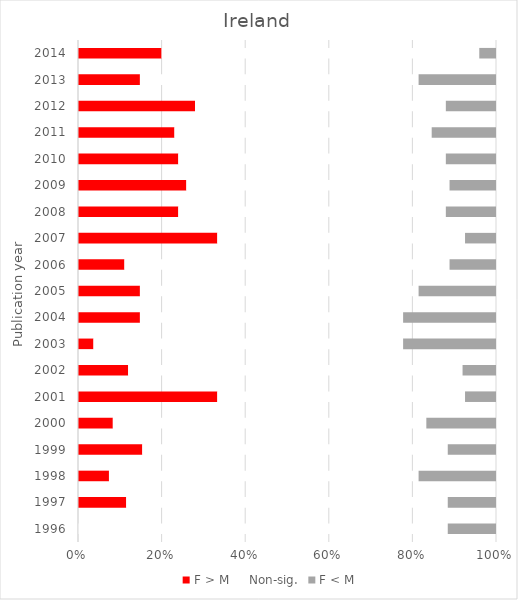
| Category | F > M | Non-sig. | F < M |
|---|---|---|---|
| 1996.0 | 0 | 23 | 3 |
| 1997.0 | 3 | 20 | 3 |
| 1998.0 | 2 | 20 | 5 |
| 1999.0 | 4 | 19 | 3 |
| 2000.0 | 2 | 18 | 4 |
| 2001.0 | 9 | 16 | 2 |
| 2002.0 | 3 | 20 | 2 |
| 2003.0 | 1 | 20 | 6 |
| 2004.0 | 4 | 17 | 6 |
| 2005.0 | 4 | 18 | 5 |
| 2006.0 | 3 | 21 | 3 |
| 2007.0 | 9 | 16 | 2 |
| 2008.0 | 6 | 16 | 3 |
| 2009.0 | 7 | 17 | 3 |
| 2010.0 | 6 | 16 | 3 |
| 2011.0 | 6 | 16 | 4 |
| 2012.0 | 7 | 15 | 3 |
| 2013.0 | 4 | 18 | 5 |
| 2014.0 | 5 | 19 | 1 |